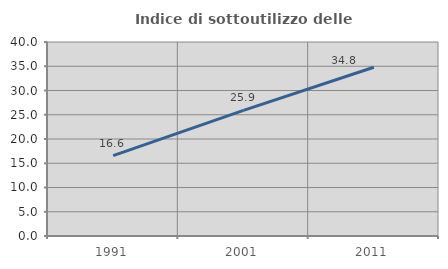
| Category | Indice di sottoutilizzo delle abitazioni  |
|---|---|
| 1991.0 | 16.578 |
| 2001.0 | 25.908 |
| 2011.0 | 34.796 |